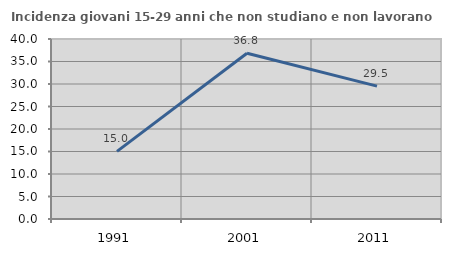
| Category | Incidenza giovani 15-29 anni che non studiano e non lavorano  |
|---|---|
| 1991.0 | 15.032 |
| 2001.0 | 36.826 |
| 2011.0 | 29.528 |